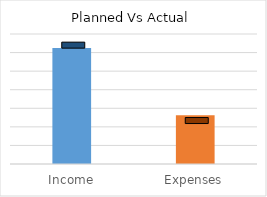
| Category | Series 0 |
|---|---|
| 0 | 6250 |
| 1 | 2630 |